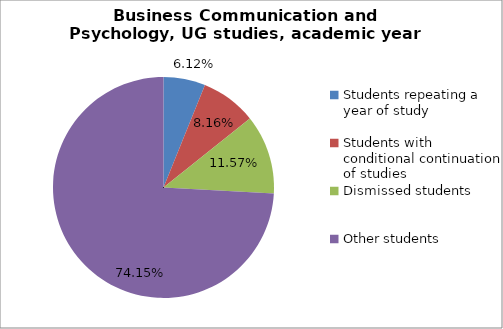
| Category | Series 0 |
|---|---|
| Students repeating a year of study | 9 |
| Students with conditional continuation of studies | 12 |
| Dismissed students | 17 |
| Other students | 109 |